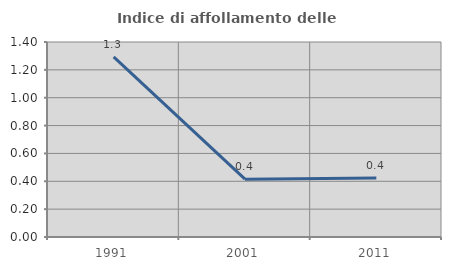
| Category | Indice di affollamento delle abitazioni  |
|---|---|
| 1991.0 | 1.293 |
| 2001.0 | 0.415 |
| 2011.0 | 0.424 |